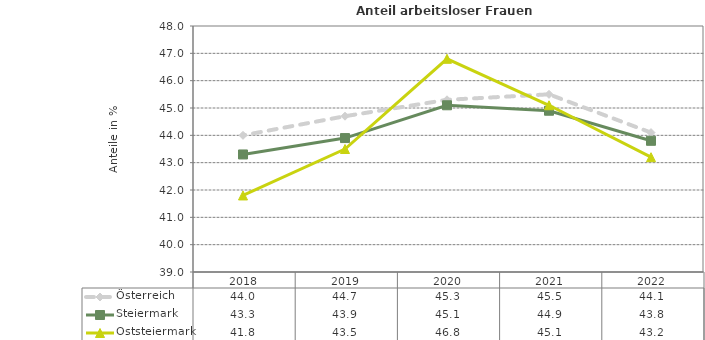
| Category | Österreich | Steiermark | Oststeiermark |
|---|---|---|---|
| 2022.0 | 44.1 | 43.8 | 43.2 |
| 2021.0 | 45.5 | 44.9 | 45.1 |
| 2020.0 | 45.3 | 45.1 | 46.8 |
| 2019.0 | 44.7 | 43.9 | 43.5 |
| 2018.0 | 44 | 43.3 | 41.8 |